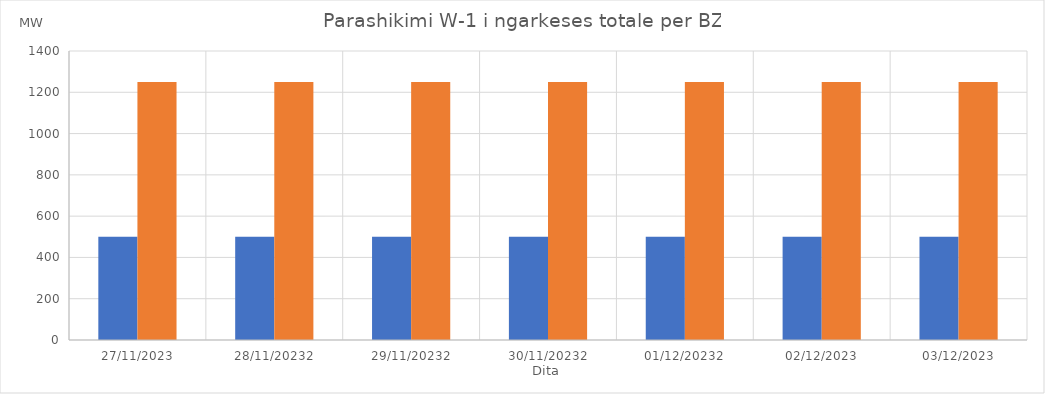
| Category | Min (MW) | Max (MW) |
|---|---|---|
| 27/11/2023 | 500 | 1250 |
| 28/11/20232 | 500 | 1250 |
| 29/11/20232 | 500 | 1250 |
| 30/11/20232 | 500 | 1250 |
| 01/12/20232 | 500 | 1250 |
| 02/12/2023 | 500 | 1250 |
| 03/12/2023 | 500 | 1250 |